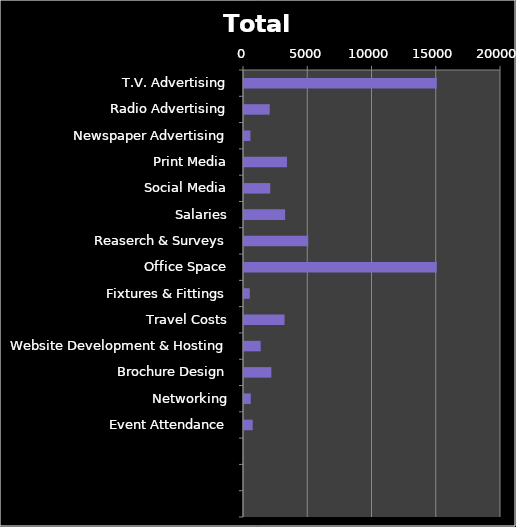
| Category | Total |
|---|---|
| T.V. Advertising | 15000 |
| Radio Advertising | 2000 |
| Newspaper Advertising | 500 |
| Print Media | 3345 |
| Social Media | 2041 |
| Salaries | 3200 |
| Reaserch & Surveys | 5000 |
| Office Space | 15000 |
| Fixtures & Fittings | 450 |
| Travel Costs | 3154 |
| Website Development & Hosting | 1300 |
| Brochure Design | 2125 |
| Networking | 525 |
| Event Attendance | 675 |